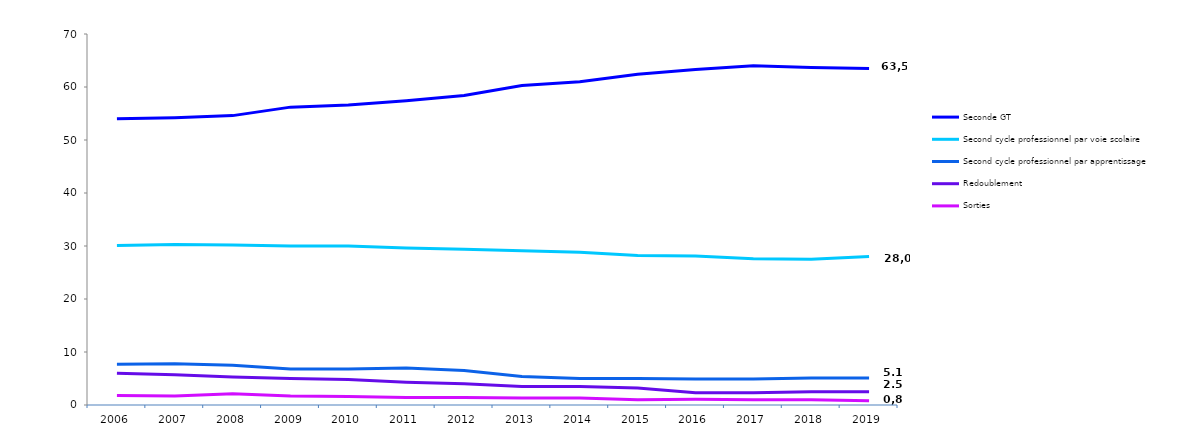
| Category | Seconde GT | Second cycle professionnel par voie scolaire | Second cycle professionnel par apprentissage | Redoublement  | Sorties |
|---|---|---|---|---|---|
| 2006.0 | 54 | 30.1 | 7.7 | 6 | 1.8 |
| 2007.0 | 54.2 | 30.3 | 7.8 | 5.7 | 1.7 |
| 2008.0 | 54.6 | 30.2 | 7.5 | 5.3 | 2.1 |
| 2009.0 | 56.2 | 30 | 6.8 | 5 | 1.7 |
| 2010.0 | 56.6 | 30 | 6.8 | 4.8 | 1.6 |
| 2011.0 | 57.4 | 29.6 | 7 | 4.3 | 1.4 |
| 2012.0 | 58.4 | 29.4 | 6.5 | 4 | 1.4 |
| 2013.0 | 60.3 | 29.1 | 5.4 | 3.5 | 1.3 |
| 2014.0 | 61 | 28.8 | 5 | 3.5 | 1.3 |
| 2015.0 | 62.4 | 28.2 | 5 | 3.2 | 1 |
| 2016.0 | 63.3 | 28.1 | 4.9 | 2.3 | 1.1 |
| 2017.0 | 64 | 27.6 | 4.9 | 2.3 | 1 |
| 2018.0 | 63.7 | 27.5 | 5.1 | 2.5 | 1 |
| 2019.0 | 63.5 | 28 | 5.1 | 2.5 | 0.8 |